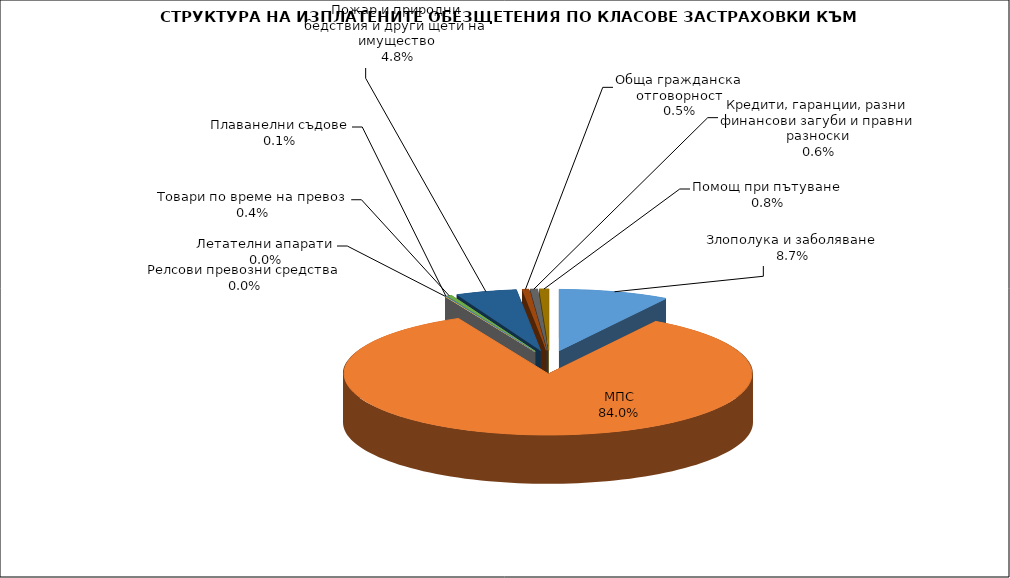
| Category | Злополука и заболяване |
|---|---|
| Злополука и заболяване | 0.087 |
| МПС | 0.84 |
| Релсови превозни средства | 0 |
| Летателни апарати | 0 |
| Плаванелни съдове | 0.001 |
| Товари по време на превоз | 0.004 |
| Пожар и природни бедствия и други щети на имущество | 0.048 |
| Обща гражданска отговорност | 0.005 |
| Кредити, гаранции, разни финансови загуби и правни разноски | 0.006 |
| Помощ при пътуване | 0.008 |